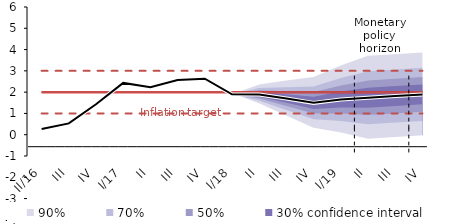
| Category | Inflation Target | Inflation Target - lower bound | Inflation Target - upper bound | linka | Střed předpovědi |
|---|---|---|---|---|---|
| II/16 | 2 | 1 | 3 | 0.267 | 0.267 |
| III | 2 | 1 | 3 | 0.533 | 0.533 |
| IV | 2 | 1 | 3 | 1.433 | 1.433 |
| I/17 | 2 | 1 | 3 | 2.433 | 2.433 |
| II | 2 | 1 | 3 | 2.233 | 2.233 |
| III | 2 | 1 | 3 | 2.567 | 2.567 |
| IV | 2 | 1 | 3 | 2.633 | 2.633 |
| I/18 | 2 | 1 | 3 | 1.9 | 1.9 |
| II | 2 | 1 | 3 | 1.892 | 1.892 |
| III | 2 | 1 | 3 | 1.697 | 1.697 |
| IV | 2 | 1 | 3 | 1.496 | 1.496 |
| I/19 | 2 | 1 | 3 | 1.652 | 1.652 |
| II | 2 | 1 | 3 | 1.737 | 1.737 |
| III | 2 | 1 | 3 | 1.817 | 1.817 |
| IV | 2 | 1 | 3 | 1.894 | 1.894 |